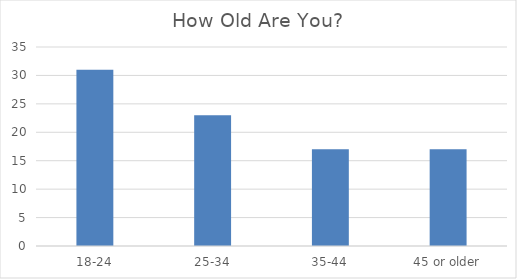
| Category | Series 0 |
|---|---|
| 18-24 | 31 |
| 25-34 | 23 |
| 35-44 | 17 |
| 45 or older | 17 |